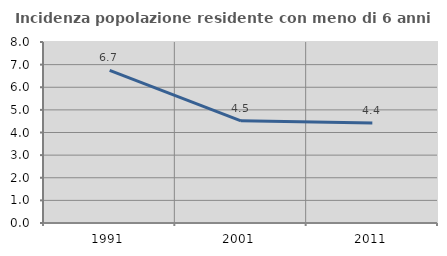
| Category | Incidenza popolazione residente con meno di 6 anni |
|---|---|
| 1991.0 | 6.742 |
| 2001.0 | 4.515 |
| 2011.0 | 4.417 |